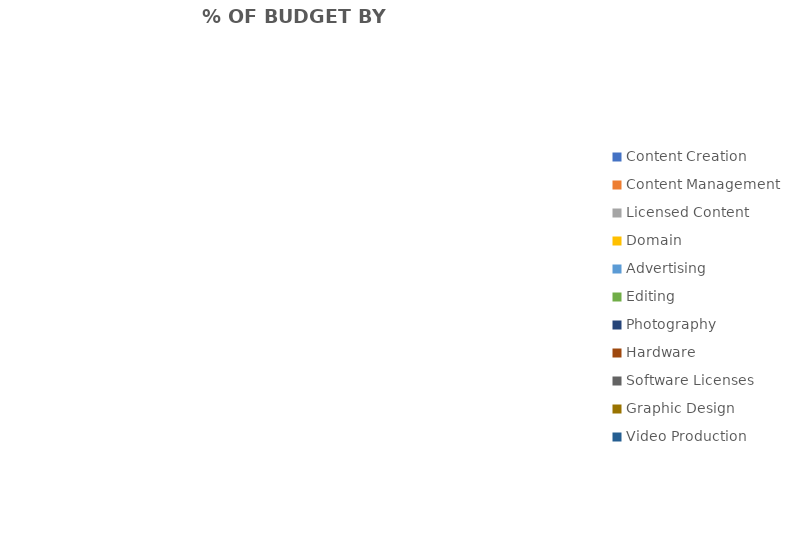
| Category | Series 0 | Series 1 |
|---|---|---|
| Content Creation |  | 0 |
| Content Management |  | 0 |
| Licensed Content |  | 0 |
| Domain |  | 0 |
| Advertising |  | 0 |
| Editing |  | 0 |
| Photography |  | 0 |
| Hardware |  | 0 |
| Software Licenses |  | 0 |
| Graphic Design |  | 0 |
| Video Production |  | 0 |